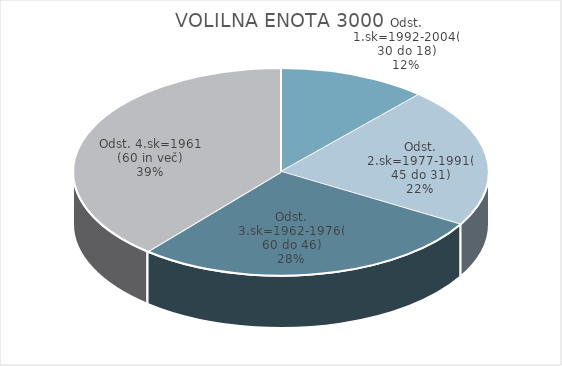
| Category | VOLILNA ENOTA 3000 |
|---|---|
| Odst. 1.sk=1992-2004(30 do 18) | 6.51 |
| Odst. 2.sk=1977-1991(45 do 31) | 12.3 |
| Odst. 3.sk=1962-1976(60 do 46) | 15.52 |
| Odst. 4.sk=1961 (60 in več) | 21.87 |